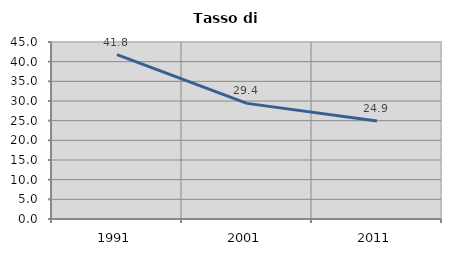
| Category | Tasso di disoccupazione   |
|---|---|
| 1991.0 | 41.815 |
| 2001.0 | 29.394 |
| 2011.0 | 24.89 |